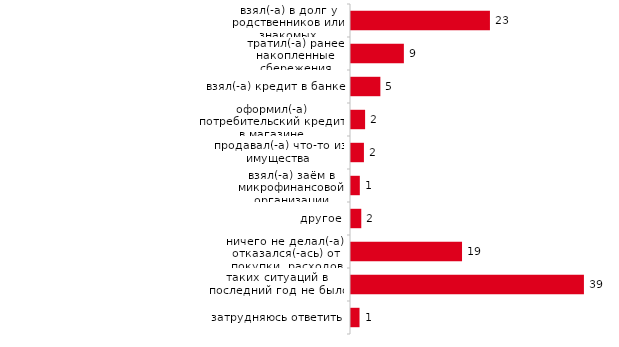
| Category | Series 0 |
|---|---|
| взял(-а) в долг у родственников или знакомых | 23.416 |
| тратил(-а) ранее накопленные сбережения | 8.911 |
| взял(-а) кредит в банке | 4.95 |
| оформил(-а) потребительский кредит в магазине | 2.376 |
| продавал(-а) что-то из имущества | 2.178 |
| взял(-а) заём в микрофинансовой организации | 1.485 |
| другое | 1.733 |
| ничего не делал(-а), отказался(-ась) от покупки, расходов | 18.713 |
| таких ситуаций в последний год не было | 39.257 |
| затрудняюсь ответить | 1.436 |